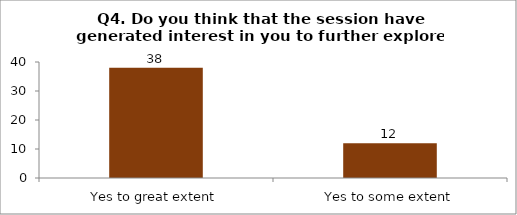
| Category | Q4. Do you think that the session have generated interest in you to further explore the topics? |
|---|---|
| Yes to great extent | 38 |
| Yes to some extent | 12 |